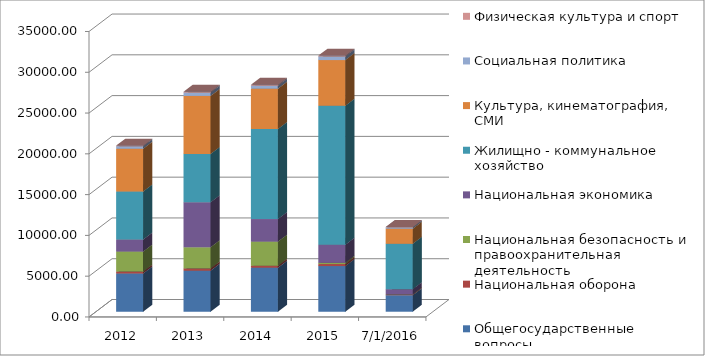
| Category | Общегосударственные вопросы | Национальная оборона | Национальная безопасность и правоохранительная деятельность | Национальная экономика | Жилищно - коммунальное хозяйство | Культура, кинематография, СМИ | Социальная политика | Физическая культура и спорт |
|---|---|---|---|---|---|---|---|---|
| 2012.0 | 4692.164 | 232.812 | 2451.473 | 1471.939 | 5881.889 | 5253.5 | 308.421 | 75 |
| 2013.0 | 5032.062 | 272.794 | 2592.465 | 5537.892 | 5891.897 | 7128.686 | 414.894 | 95 |
| 2014.0 | 5404.168 | 229.8 | 2963.109 | 2766.841 | 11028.448 | 4956.468 | 371.71 | 101 |
| 2015.0 | 5595.761 | 250.1 | 150 | 2216.367 | 17030.049 | 5608.309 | 449.08 | 101 |
| 42552.0 | 2022.571 | 92.427 | 3.2 | 645.607 | 5562.853 | 1850.859 | 172.063 | 45 |